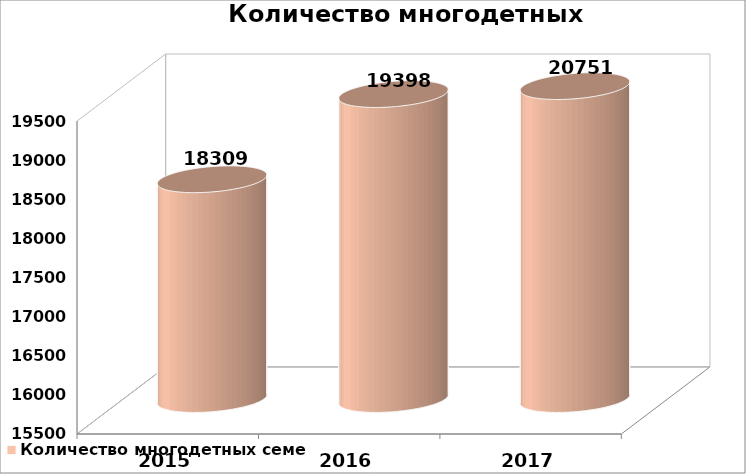
| Category | Количество многодетных семей |
|---|---|
| 2015.0 | 18309 |
| 2016.0 | 19398 |
| 2017.0 | 20751 |